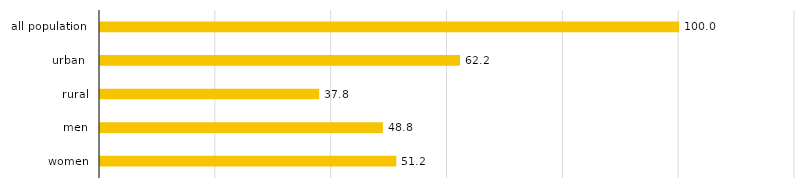
| Category | Series 0 |
|---|---|
| women | 51.164 |
| men | 48.836 |
| rural | 37.849 |
| urban  | 62.151 |
| all population  | 100 |